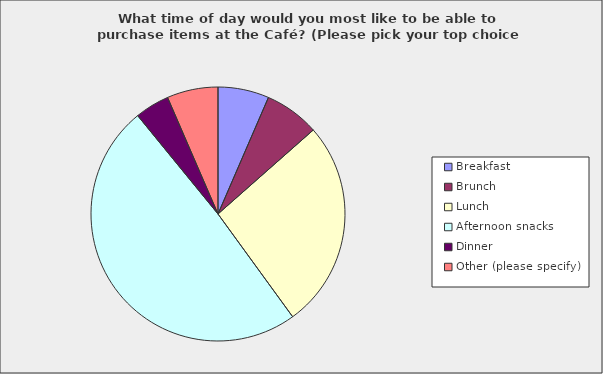
| Category | Series 0 |
|---|---|
| Breakfast | 0.065 |
| Brunch | 0.07 |
| Lunch | 0.265 |
| Afternoon snacks | 0.491 |
| Dinner | 0.044 |
| Other (please specify) | 0.065 |